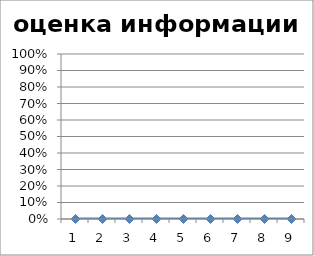
| Category | оценка информации |
|---|---|
| 1.0 | 0 |
| 2.0 | 0 |
| 3.0 | 0 |
| 4.0 | 0 |
| 5.0 | 0 |
| 6.0 | 0 |
| 7.0 | 0 |
| 8.0 | 0 |
| 9.0 | 0 |